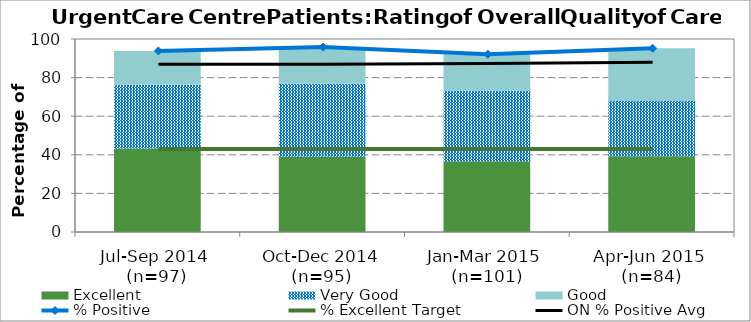
| Category | Excellent | Very Good | Good |
|---|---|---|---|
| Jul-Sep 2014 
(n=97) | 43.3 | 32.99 | 17.53 |
| Oct-Dec 2014 (n=95) | 38.95 | 37.89 | 18.95 |
| Jan-Mar 2015 
(n=101) | 36.63 | 36.63 | 18.81 |
| Apr-Jun 2015 
(n=84) | 39.29 | 28.57 | 27.38 |